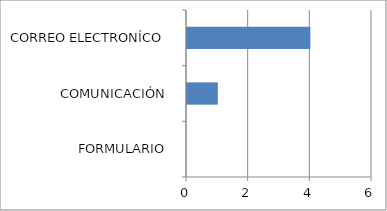
| Category | Series 0 |
|---|---|
| FORMULARIO  | 0 |
| COMUNICACIÓN  | 1 |
| CORREO ELECTRONÍCO  | 4 |